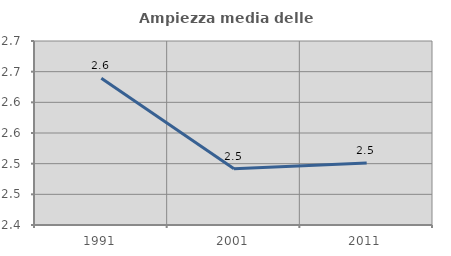
| Category | Ampiezza media delle famiglie |
|---|---|
| 1991.0 | 2.639 |
| 2001.0 | 2.492 |
| 2011.0 | 2.501 |